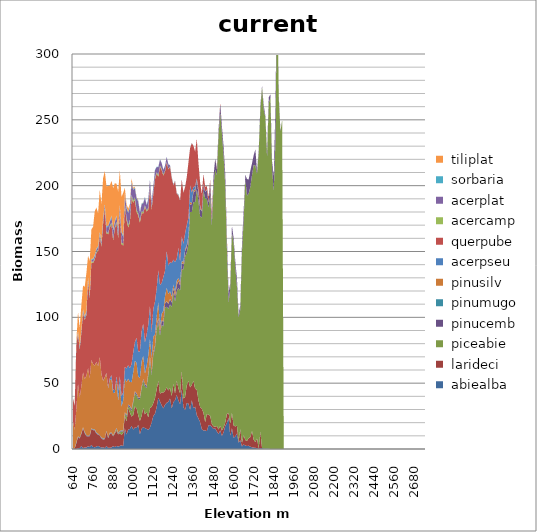
| Category |  abiealba |  larideci |  piceabie |  pinucemb |  pinumugo |  pinusilv |  acerpseu |  querpube |  acercamp |  acerplat |  sorbaria |  tiliplat |
|---|---|---|---|---|---|---|---|---|---|---|---|---|
| 640.0 | 0.045 | 0.165 | 0 | 0.03 | 0.189 | 20.606 | 0 | 17.3 | 0.026 | 0.019 | 0.17 | 0.068 |
| 650.0 | 0.022 | 0.482 | 0 | 0.022 | 0.097 | 14.053 | 0 | 18.349 | 0.005 | 0.007 | 0.205 | 0.013 |
| 660.0 | 0.098 | 4.275 | 0 | 0.074 | 0.725 | 25.1 | 0 | 48.806 | 0.112 | 0.18 | 0.91 | 1.466 |
| 670.0 | 0.57 | 8.573 | 0.001 | 0.202 | 0.327 | 39.903 | 0 | 38.181 | 0.405 | 0.538 | 0.806 | 14.543 |
| 680.0 | 0.747 | 7.256 | 0 | 0.174 | 0.423 | 30.236 | 0 | 36.613 | 0.552 | 1.163 | 0.804 | 14.291 |
| 690.0 | 2.263 | 9.18 | 0.002 | 0.296 | 0.41 | 35.706 | 0.006 | 40.418 | 0.547 | 1.006 | 0.756 | 18.481 |
| 700.0 | 0.754 | 15.101 | 0.001 | 0.322 | 0.296 | 41.645 | 0.026 | 45.237 | 0.714 | 1.195 | 0.726 | 18.106 |
| 710.0 | 1.177 | 10.868 | 0.007 | 0.256 | 0.57 | 40.216 | 0.007 | 44.937 | 0.601 | 1.21 | 0.756 | 22.521 |
| 720.0 | 1.114 | 8.67 | 0.009 | 0.309 | 0.371 | 45.016 | 0.027 | 46.165 | 0.703 | 1.692 | 0.746 | 28.699 |
| 730.0 | 2.077 | 7.333 | 0.012 | 0.393 | 0.241 | 51.374 | 0.028 | 66.482 | 0.728 | 1.085 | 0.638 | 16.408 |
| 740.0 | 1.568 | 8.209 | 0.017 | 0.365 | 0.386 | 43.13 | 0.019 | 60.486 | 0.671 | 1.351 | 0.749 | 25.86 |
| 750.0 | 3.039 | 12.039 | 0.015 | 0.403 | 0.262 | 51.807 | 0.028 | 74.056 | 0.784 | 1.312 | 0.732 | 22.449 |
| 760.0 | 1.551 | 12.736 | 0.032 | 0.302 | 0.314 | 49.598 | 0.033 | 76.826 | 0.766 | 1.515 | 0.733 | 24.263 |
| 770.0 | 1.296 | 12.858 | 0.044 | 0.403 | 0.456 | 48.348 | 0.082 | 80.326 | 0.962 | 1.859 | 0.823 | 33.179 |
| 780.0 | 1.835 | 9.694 | 0.022 | 0.603 | 0.406 | 53.457 | 0.046 | 82.959 | 0.764 | 1.611 | 0.834 | 31.174 |
| 790.0 | 2.346 | 8.57 | 0.029 | 0.438 | 0.269 | 51.284 | 0.111 | 87.372 | 0.913 | 2.004 | 0.793 | 24.904 |
| 800.0 | 1.64 | 8.294 | 0.03 | 0.336 | 0.136 | 59.486 | 0.113 | 91.709 | 0.953 | 1.502 | 0.701 | 32.12 |
| 810.0 | 1.062 | 6.968 | 0.068 | 0.368 | 0.356 | 48.033 | 0.141 | 96.636 | 1.068 | 2.155 | 0.757 | 28.467 |
| 820.0 | 1.347 | 5.834 | 0.123 | 0.393 | 0.361 | 43.688 | 0.203 | 119.248 | 1.184 | 2.582 | 0.582 | 30.173 |
| 830.0 | 0.772 | 6.678 | 0.063 | 0.447 | 0.283 | 45.928 | 0.228 | 127.816 | 0.99 | 2.377 | 0.692 | 25.003 |
| 840.0 | 2.128 | 10.9 | 0.061 | 0.391 | 0.345 | 43.73 | 0.374 | 105.888 | 0.922 | 3.436 | 0.857 | 30.543 |
| 850.0 | 0.929 | 7.341 | 0.122 | 0.313 | 0.325 | 37.367 | 0.67 | 116.093 | 0.89 | 4.943 | 0.699 | 30.018 |
| 860.0 | 0.903 | 10.549 | 0.096 | 0.332 | 0.437 | 39.898 | 1.691 | 114.522 | 0.926 | 2.991 | 0.879 | 26.837 |
| 870.0 | 1.194 | 10.427 | 0.213 | 0.553 | 0.251 | 40.494 | 2.921 | 114.452 | 1.404 | 4.255 | 1.18 | 26.314 |
| 880.0 | 2.166 | 7.409 | 0.204 | 0.318 | 0.219 | 32.124 | 2.841 | 113.205 | 1.113 | 6.529 | 0.697 | 31.377 |
| 890.0 | 1.425 | 10.398 | 0.543 | 0.439 | 0.218 | 29.998 | 1.509 | 122.945 | 1.151 | 3.633 | 0.894 | 28.642 |
| 900.0 | 2.304 | 11.706 | 1.045 | 0.552 | 0.371 | 36.487 | 2.917 | 116.057 | 1.22 | 3.853 | 0.902 | 24.103 |
| 910.0 | 1.826 | 9.283 | 0.486 | 0.48 | 0.189 | 24.493 | 7.513 | 116.055 | 1.265 | 4.622 | 0.902 | 28.293 |
| 920.0 | 2.286 | 9.676 | 0.625 | 0.542 | 0.488 | 36.888 | 4.686 | 123.482 | 1.321 | 4.417 | 0.764 | 26.336 |
| 930.0 | 2.843 | 7.768 | 2.692 | 0.58 | 0.352 | 17.868 | 7.976 | 115.393 | 1.354 | 7.47 | 0.869 | 26.207 |
| 940.0 | 2.255 | 10.007 | 1.147 | 0.59 | 0.146 | 22.882 | 6.05 | 111.531 | 1.421 | 5.092 | 0.993 | 32.527 |
| 950.0 | 15.598 | 9.467 | 1.775 | 0.751 | 0.206 | 25.907 | 8.581 | 122.386 | 1.801 | 6.946 | 0.698 | 4.201 |
| 960.0 | 10.999 | 9.895 | 3.638 | 0.921 | 0.285 | 25.302 | 10.086 | 112.749 | 1.773 | 7.096 | 0.849 | 2.35 |
| 970.0 | 14.794 | 16.235 | 1.497 | 0.922 | 0.326 | 19.682 | 10.166 | 104.563 | 1.639 | 9.415 | 0.771 | 2.54 |
| 980.0 | 15.187 | 12.595 | 3.257 | 1.408 | 0.289 | 18.145 | 10.567 | 110.516 | 1.974 | 9.513 | 0.852 | 1.7 |
| 990.0 | 17.626 | 6.924 | 4.262 | 1.113 | 0.372 | 20.442 | 13.787 | 126.476 | 2.164 | 9.131 | 0.663 | 2.687 |
| 1000.0 | 14.758 | 11.01 | 9.418 | 1.17 | 0.368 | 21.619 | 15.111 | 113.519 | 1.609 | 8.163 | 0.674 | 0.93 |
| 1010.0 | 16.34 | 16.013 | 9.961 | 1.249 | 0.231 | 23.073 | 14.25 | 108.256 | 1.733 | 6.832 | 0.72 | 0.607 |
| 1020.0 | 15.966 | 15.061 | 9.639 | 1.287 | 0.378 | 23.09 | 19.148 | 95.611 | 1.562 | 8.528 | 0.754 | 0.538 |
| 1030.0 | 18.377 | 7.151 | 12.429 | 0.858 | 0.264 | 15.939 | 18.979 | 103.506 | 1.486 | 9.011 | 0.594 | 0.437 |
| 1040.0 | 11.214 | 10.153 | 16.424 | 1.088 | 0.167 | 15.042 | 20.107 | 97.819 | 1.413 | 5.77 | 0.716 | 0.209 |
| 1050.0 | 15.423 | 9.761 | 20.845 | 1.099 | 0.189 | 19.058 | 23.182 | 89.633 | 1.266 | 5.298 | 0.566 | 0.131 |
| 1060.0 | 16.624 | 14.67 | 20.577 | 1.063 | 0.29 | 17.797 | 24.213 | 83.664 | 1.216 | 6.641 | 0.415 | 0.095 |
| 1070.0 | 15.839 | 10.435 | 21.353 | 1.48 | 0.304 | 7.932 | 23.554 | 103.041 | 1.092 | 5.928 | 0.452 | 0.075 |
| 1080.0 | 15.252 | 12.935 | 18.279 | 1.288 | 0.195 | 14.976 | 23.881 | 93.625 | 0.88 | 3.885 | 0.391 | 0.033 |
| 1090.0 | 14.552 | 9.35 | 31.796 | 1.605 | 0.419 | 13.377 | 23.297 | 87.468 | 1.234 | 6.412 | 0.377 | 0.045 |
| 1100.0 | 16.262 | 14.868 | 36.341 | 2.46 | 0.297 | 13.358 | 25.081 | 89.616 | 0.986 | 5.006 | 0.358 | 0.028 |
| 1110.0 | 20.195 | 11.8 | 24.449 | 1.726 | 0.24 | 10.784 | 20.04 | 92.885 | 1.16 | 4.136 | 0.332 | 0.034 |
| 1120.0 | 25.054 | 9.723 | 36.49 | 2.156 | 0.176 | 11.926 | 20.917 | 87.077 | 0.94 | 4.344 | 0.334 | 0.01 |
| 1130.0 | 26.802 | 11.704 | 38.084 | 1.629 | 0.236 | 8.513 | 24.909 | 92.922 | 1.105 | 5.9 | 0.377 | 0.004 |
| 1140.0 | 31.635 | 13.57 | 45.485 | 2.238 | 0.176 | 7.403 | 21.321 | 87.578 | 0.855 | 3.873 | 0.309 | 0.001 |
| 1150.0 | 38.915 | 12.912 | 44.525 | 2.999 | 0.179 | 12.164 | 24.103 | 71.059 | 1.135 | 6.058 | 0.231 | 0.001 |
| 1160.0 | 36.066 | 5.911 | 44.17 | 2.498 | 0.099 | 3.999 | 31.774 | 89.829 | 0.922 | 4.647 | 0.171 | 0.001 |
| 1170.0 | 33.146 | 9.966 | 51.441 | 3.077 | 0.173 | 4.975 | 23.414 | 85.691 | 0.897 | 4.305 | 0.242 | 0 |
| 1180.0 | 30.826 | 11.978 | 50.262 | 3.432 | 0.203 | 8.236 | 25.602 | 77.091 | 0.85 | 3.508 | 0.247 | 0 |
| 1190.0 | 33.594 | 10.64 | 62.838 | 3.374 | 0.17 | 5.468 | 19.341 | 75.275 | 0.73 | 3.546 | 0.205 | 0 |
| 1200.0 | 35.096 | 11.694 | 61.329 | 3.969 | 0.191 | 10.11 | 28.347 | 66.912 | 0.371 | 3.778 | 0.162 | 0 |
| 1210.0 | 35.743 | 8.705 | 61.913 | 3.678 | 0.276 | 7.463 | 21.506 | 73.118 | 0.374 | 3.431 | 0.18 | 0 |
| 1220.0 | 38.485 | 7.852 | 63.553 | 3.968 | 0.169 | 5.982 | 21.9 | 72.467 | 0.356 | 0.709 | 0.163 | 0 |
| 1230.0 | 30.702 | 9.357 | 67.815 | 3.297 | 0.167 | 4.456 | 25.446 | 64.674 | 0.24 | 0.489 | 0.154 | 0 |
| 1240.0 | 35.566 | 13.826 | 69.155 | 3.278 | 0.184 | 2.777 | 18.971 | 56.542 | 0.222 | 0.5 | 0.111 | 0 |
| 1250.0 | 36.976 | 5.206 | 69.856 | 3.79 | 0.089 | 3.267 | 22.872 | 61.274 | 0.237 | 0.292 | 0.192 | 0 |
| 1260.0 | 41.161 | 10.74 | 67.761 | 4.607 | 0.145 | 3.425 | 16.56 | 49.521 | 0.215 | 0.273 | 0.08 | 0 |
| 1270.0 | 36.864 | 9.284 | 76.17 | 5.406 | 0.121 | 1.999 | 22.98 | 39.889 | 0.234 | 0.332 | 0.146 | 0 |
| 1280.0 | 34.014 | 8.223 | 77.911 | 3.975 | 0.217 | 2.538 | 15.679 | 46.072 | 0.197 | 0.258 | 0.127 | 0 |
| 1290.0 | 45.337 | 14.294 | 76.727 | 4.693 | 0.13 | 1.344 | 19.083 | 43.047 | 0.125 | 0.174 | 0.071 | 0 |
| 1300.0 | 31.785 | 6.521 | 98.287 | 3.562 | 0.183 | 2.112 | 13.443 | 38.736 | 0.09 | 0.188 | 0.102 | 0 |
| 1310.0 | 29.403 | 10.059 | 106.527 | 4.299 | 0.094 | 1.19 | 12.054 | 35.306 | 0.055 | 0.117 | 0.076 | 0 |
| 1320.0 | 34.987 | 13.327 | 100.995 | 3.99 | 0.159 | 1.332 | 15.362 | 36.166 | 0.055 | 0.093 | 0.084 | 0 |
| 1330.0 | 34.515 | 17.239 | 103.982 | 4.706 | 0.127 | 1.221 | 13.86 | 42.021 | 0.036 | 0.049 | 0.086 | 0 |
| 1340.0 | 29.758 | 17.036 | 133.289 | 5.28 | 0.242 | 1.938 | 12.64 | 28.36 | 0.022 | 0.036 | 0.075 | 0 |
| 1350.0 | 37.223 | 11.443 | 131.379 | 5.943 | 0.059 | 0.775 | 8.025 | 37.503 | 0.017 | 0.035 | 0.071 | 0 |
| 1360.0 | 30.95 | 20.792 | 135.684 | 7.622 | 0.047 | 1.46 | 2.39 | 31.277 | 0.014 | 0.028 | 0.039 | 0 |
| 1370.0 | 32.12 | 13.649 | 141.867 | 8.136 | 0.059 | 1.37 | 2.489 | 26.163 | 0.01 | 0.012 | 0.052 | 0 |
| 1380.0 | 25.647 | 19.439 | 152.301 | 6.433 | 0.145 | 0.463 | 1.276 | 29.966 | 0.006 | 0.01 | 0.04 | 0 |
| 1390.0 | 23.172 | 13.628 | 151.154 | 5.933 | 0.107 | 1.795 | 1.158 | 20.08 | 0.011 | 0.013 | 0.033 | 0 |
| 1400.0 | 20.374 | 11.461 | 144.844 | 5.674 | 0.132 | 1.682 | 0.773 | 17.485 | 0.005 | 0.007 | 0.046 | 0 |
| 1410.0 | 15.06 | 15.558 | 145.1 | 4.592 | 0.024 | 0.112 | 0.494 | 12.957 | 0 | 0.004 | 0.024 | 0 |
| 1420.0 | 13.959 | 13.577 | 168.637 | 4.473 | 0.002 | 0.512 | 0.578 | 7.208 | 0 | 0.001 | 0.011 | 0 |
| 1430.0 | 14.23 | 6.203 | 169.893 | 4.68 | 0.002 | 0.016 | 0.44 | 3.658 | 0 | 0.001 | 0.008 | 0 |
| 1440.0 | 13.55 | 13.077 | 163.463 | 6.456 | 0.107 | 0.162 | 0.405 | 2.5 | 0 | 0.001 | 0.012 | 0 |
| 1450.0 | 17.95 | 8.092 | 157.37 | 3.671 | 0.015 | 0.055 | 0.322 | 3.754 | 0 | 0 | 0.013 | 0 |
| 1460.0 | 18.104 | 7.12 | 166.808 | 9.259 | 0.082 | 0.473 | 0.246 | 2.441 | 0 | 0 | 0.005 | 0 |
| 1470.0 | 16.638 | 2.348 | 150.881 | 4.305 | 0.166 | 0.316 | 0.152 | 4.447 | 0 | 0 | 0.004 | 0 |
| 1480.0 | 15.212 | 2.043 | 183.329 | 6.586 | 0.026 | 0.005 | 0.109 | 0.189 | 0 | 0 | 0.007 | 0 |
| 1490.0 | 15.632 | 1.194 | 195.193 | 8.454 | 0.008 | 0.006 | 0.101 | 0.051 | 0 | 0 | 0.001 | 0 |
| 1500.0 | 13.317 | 4.111 | 190.842 | 4.34 | 0.076 | 0.488 | 0.109 | 0.647 | 0 | 0 | 0.003 | 0 |
| 1510.0 | 11.319 | 3.467 | 223.963 | 3.545 | 0.025 | 0.215 | 0.028 | 0.192 | 0 | 0 | 0 | 0 |
| 1520.0 | 14.156 | 3.498 | 237.936 | 6.402 | 0.01 | 0.223 | 0.052 | 0.765 | 0 | 0 | 0 | 0 |
| 1530.0 | 9.875 | 4.17 | 225.889 | 5.264 | 0.04 | 0.062 | 0.042 | 0.026 | 0 | 0 | 0 | 0 |
| 1540.0 | 12.646 | 3.795 | 206.668 | 6.664 | 0.157 | 0.061 | 0.013 | 0.033 | 0 | 0 | 0 | 0 |
| 1550.0 | 17.311 | 2.61 | 179.89 | 8.876 | 0.223 | 0.499 | 0.015 | 0.017 | 0 | 0 | 0 | 0 |
| 1560.0 | 19.854 | 6.925 | 124.693 | 7.415 | 0.208 | 2.085 | 0.005 | 0.077 | 0 | 0 | 0 | 0 |
| 1570.0 | 23.539 | 3.744 | 84.114 | 6.823 | 0.455 | 0.298 | 0.002 | 0.036 | 0 | 0 | 0 | 0 |
| 1580.0 | 9.95 | 9.152 | 102.982 | 3.732 | 0 | 0.329 | 0 | 0 | 0 | 0 | 0 | 0 |
| 1590.0 | 15.758 | 11.684 | 136.405 | 5.656 | 0 | 0 | 0 | 0.013 | 0 | 0 | 0 | 0 |
| 1600.0 | 8.491 | 9.452 | 138.997 | 3.273 | 0 | 0 | 0 | 0.004 | 0 | 0 | 0 | 0 |
| 1610.0 | 9.629 | 7.5 | 121.045 | 4.661 | 0.117 | 0.035 | 0 | 0.003 | 0 | 0 | 0 | 0 |
| 1620.0 | 11.676 | 6.011 | 105.545 | 6.178 | 0.052 | 0.193 | 0 | 0 | 0 | 0 | 0 | 0 |
| 1630.0 | 4.848 | 0.955 | 94.472 | 2.149 | 0.097 | 0.002 | 0 | 0.002 | 0 | 0 | 0 | 0 |
| 1640.0 | 6.632 | 8.587 | 90.572 | 3.474 | 0.052 | 0.035 | 0 | 0 | 0 | 0 | 0 | 0 |
| 1650.0 | 1.863 | 2.772 | 145.169 | 5.782 | 0.01 | 0.003 | 0 | 0 | 0 | 0 | 0 | 0 |
| 1660.0 | 3.516 | 6.996 | 162.733 | 7.312 | 0.133 | 0.022 | 0 | 0.004 | 0 | 0 | 0 | 0 |
| 1670.0 | 2.635 | 4.109 | 198.21 | 3.276 | 0 | 0 | 0 | 0 | 0 | 0 | 0 | 0 |
| 1680.0 | 2.285 | 3.894 | 186.289 | 12.525 | 0 | 0 | 0 | 0 | 0 | 0 | 0 | 0 |
| 1690.0 | 2.473 | 5.789 | 185.633 | 10.802 | 0 | 0.022 | 0 | 0 | 0 | 0 | 0 | 0 |
| 1700.0 | 1.758 | 7.204 | 190.215 | 12.143 | 0 | 0 | 0 | 0 | 0 | 0 | 0 | 0 |
| 1710.0 | 1.226 | 12.443 | 194.346 | 8.955 | 0 | 0 | 0 | 0 | 0 | 0 | 0 | 0 |
| 1720.0 | 1.063 | 5.918 | 208.722 | 7.429 | 0 | 0 | 0 | 0 | 0 | 0 | 0 | 0 |
| 1730.0 | 0.946 | 4.363 | 210.02 | 12.136 | 0 | 0 | 0 | 0 | 0 | 0 | 0 | 0 |
| 1740.0 | 0.558 | 7.463 | 200.795 | 2.017 | 0 | 0 | 0 | 0 | 0 | 0 | 0 | 0 |
| 1750.0 | 0.428 | 0 | 224.93 | 1.892 | 0 | 0 | 0 | 0 | 0 | 0 | 0 | 0 |
| 1760.0 | 0.446 | 12.407 | 244.848 | 3.287 | 0.07 | 0 | 0 | 0 | 0 | 0 | 0 | 0 |
| 1770.0 | 0.568 | 0 | 274.458 | 0.966 | 0 | 0 | 0 | 0 | 0 | 0 | 0 | 0 |
| 1780.0 | 0.44 | 0 | 257.227 | 3.488 | 0 | 0 | 0 | 0 | 0 | 0 | 0 | 0 |
| 1790.0 | 0.19 | 0 | 251.614 | 1.099 | 0 | 0 | 0 | 0 | 0 | 0 | 0 | 0 |
| 1800.0 | 0.348 | 0 | 220.92 | 4.276 | 0 | 0 | 0 | 0 | 0 | 0 | 0 | 0 |
| 1810.0 | 0.184 | 0 | 262.449 | 4.45 | 0 | 0 | 0 | 0 | 0 | 0 | 0 | 0 |
| 1820.0 | 0.025 | 0 | 266.749 | 2.547 | 0 | 0 | 0 | 0 | 0 | 0 | 0 | 0 |
| 1830.0 | 0 | 0 | 213.536 | 4.899 | 0 | 0 | 0 | 0 | 0 | 0 | 0 | 0 |
| 1840.0 | 0 | 0 | 195.533 | 11.402 | 0 | 0 | 0 | 0 | 0 | 0 | 0 | 0 |
| 1850.0 | 0 | 0 | 232.883 | 27.498 | 0 | 0 | 0 | 0 | 0 | 0 | 0 | 0 |
| 1860.0 | 0 | 0 | 358.886 | 0 | 0 | 0 | 0 | 0 | 0 | 0 | 0 | 0 |
| 1870.0 | 0 | 0 | 265.591 | 3.336 | 0 | 0 | 0 | 0 | 0 | 0 | 0 | 0 |
| 1880.0 | 0 | 0 | 241.064 | 0.724 | 0 | 0 | 0 | 0 | 0 | 0 | 0 | 0 |
| 1890.0 | 0 | 0 | 249.871 | 0 | 0 | 0 | 0 | 0 | 0 | 0 | 0 | 0 |
| 1900.0 | 0 | 0 | 0 | 0 | 0 | 0 | 0 | 0 | 0 | 0 | 0 | 0 |
| 1910.0 | 0 | 0 | 0 | 0 | 0 | 0 | 0 | 0 | 0 | 0 | 0 | 0 |
| 1920.0 | 0 | 0 | 0 | 0 | 0 | 0 | 0 | 0 | 0 | 0 | 0 | 0 |
| 1930.0 | 0 | 0 | 0 | 0 | 0 | 0 | 0 | 0 | 0 | 0 | 0 | 0 |
| 1940.0 | 0 | 0 | 0 | 0 | 0 | 0 | 0 | 0 | 0 | 0 | 0 | 0 |
| 1950.0 | 0 | 0 | 0 | 0 | 0 | 0 | 0 | 0 | 0 | 0 | 0 | 0 |
| 1960.0 | 0 | 0 | 0 | 0 | 0 | 0 | 0 | 0 | 0 | 0 | 0 | 0 |
| 1970.0 | 0 | 0 | 0 | 0 | 0 | 0 | 0 | 0 | 0 | 0 | 0 | 0 |
| 1980.0 | 0 | 0 | 0 | 0 | 0 | 0 | 0 | 0 | 0 | 0 | 0 | 0 |
| 1990.0 | 0 | 0 | 0 | 0 | 0 | 0 | 0 | 0 | 0 | 0 | 0 | 0 |
| 2000.0 | 0 | 0 | 0 | 0 | 0 | 0 | 0 | 0 | 0 | 0 | 0 | 0 |
| 2010.0 | 0 | 0 | 0 | 0 | 0 | 0 | 0 | 0 | 0 | 0 | 0 | 0 |
| 2020.0 | 0 | 0 | 0 | 0 | 0 | 0 | 0 | 0 | 0 | 0 | 0 | 0 |
| 2030.0 | 0 | 0 | 0 | 0 | 0 | 0 | 0 | 0 | 0 | 0 | 0 | 0 |
| 2040.0 | 0 | 0 | 0 | 0 | 0 | 0 | 0 | 0 | 0 | 0 | 0 | 0 |
| 2050.0 | 0 | 0 | 0 | 0 | 0 | 0 | 0 | 0 | 0 | 0 | 0 | 0 |
| 2060.0 | 0 | 0 | 0 | 0 | 0 | 0 | 0 | 0 | 0 | 0 | 0 | 0 |
| 2070.0 | 0 | 0 | 0 | 0 | 0 | 0 | 0 | 0 | 0 | 0 | 0 | 0 |
| 2080.0 | 0 | 0 | 0 | 0 | 0 | 0 | 0 | 0 | 0 | 0 | 0 | 0 |
| 2090.0 | 0 | 0 | 0 | 0 | 0 | 0 | 0 | 0 | 0 | 0 | 0 | 0 |
| 2100.0 | 0 | 0 | 0 | 0 | 0 | 0 | 0 | 0 | 0 | 0 | 0 | 0 |
| 2110.0 | 0 | 0 | 0 | 0 | 0 | 0 | 0 | 0 | 0 | 0 | 0 | 0 |
| 2120.0 | 0 | 0 | 0 | 0 | 0 | 0 | 0 | 0 | 0 | 0 | 0 | 0 |
| 2130.0 | 0 | 0 | 0 | 0 | 0 | 0 | 0 | 0 | 0 | 0 | 0 | 0 |
| 2140.0 | 0 | 0 | 0 | 0 | 0 | 0 | 0 | 0 | 0 | 0 | 0 | 0 |
| 2150.0 | 0 | 0 | 0 | 0 | 0 | 0 | 0 | 0 | 0 | 0 | 0 | 0 |
| 2160.0 | 0 | 0 | 0 | 0 | 0 | 0 | 0 | 0 | 0 | 0 | 0 | 0 |
| 2170.0 | 0 | 0 | 0 | 0 | 0 | 0 | 0 | 0 | 0 | 0 | 0 | 0 |
| 2180.0 | 0 | 0 | 0 | 0 | 0 | 0 | 0 | 0 | 0 | 0 | 0 | 0 |
| 2190.0 | 0 | 0 | 0 | 0 | 0 | 0 | 0 | 0 | 0 | 0 | 0 | 0 |
| 2200.0 | 0 | 0 | 0 | 0 | 0 | 0 | 0 | 0 | 0 | 0 | 0 | 0 |
| 2210.0 | 0 | 0 | 0 | 0 | 0 | 0 | 0 | 0 | 0 | 0 | 0 | 0 |
| 2220.0 | 0 | 0 | 0 | 0 | 0 | 0 | 0 | 0 | 0 | 0 | 0 | 0 |
| 2230.0 | 0 | 0 | 0 | 0 | 0 | 0 | 0 | 0 | 0 | 0 | 0 | 0 |
| 2240.0 | 0 | 0 | 0 | 0 | 0 | 0 | 0 | 0 | 0 | 0 | 0 | 0 |
| 2250.0 | 0 | 0 | 0 | 0 | 0 | 0 | 0 | 0 | 0 | 0 | 0 | 0 |
| 2260.0 | 0 | 0 | 0 | 0 | 0 | 0 | 0 | 0 | 0 | 0 | 0 | 0 |
| 2270.0 | 0 | 0 | 0 | 0 | 0 | 0 | 0 | 0 | 0 | 0 | 0 | 0 |
| 2280.0 | 0 | 0 | 0 | 0 | 0 | 0 | 0 | 0 | 0 | 0 | 0 | 0 |
| 2290.0 | 0 | 0 | 0 | 0 | 0 | 0 | 0 | 0 | 0 | 0 | 0 | 0 |
| 2300.0 | 0 | 0 | 0 | 0 | 0 | 0 | 0 | 0 | 0 | 0 | 0 | 0 |
| 2310.0 | 0 | 0 | 0 | 0 | 0 | 0 | 0 | 0 | 0 | 0 | 0 | 0 |
| 2320.0 | 0 | 0 | 0 | 0 | 0 | 0 | 0 | 0 | 0 | 0 | 0 | 0 |
| 2330.0 | 0 | 0 | 0 | 0 | 0 | 0 | 0 | 0 | 0 | 0 | 0 | 0 |
| 2340.0 | 0 | 0 | 0 | 0 | 0 | 0 | 0 | 0 | 0 | 0 | 0 | 0 |
| 2350.0 | 0 | 0 | 0 | 0 | 0 | 0 | 0 | 0 | 0 | 0 | 0 | 0 |
| 2360.0 | 0 | 0 | 0 | 0 | 0 | 0 | 0 | 0 | 0 | 0 | 0 | 0 |
| 2370.0 | 0 | 0 | 0 | 0 | 0 | 0 | 0 | 0 | 0 | 0 | 0 | 0 |
| 2380.0 | 0 | 0 | 0 | 0 | 0 | 0 | 0 | 0 | 0 | 0 | 0 | 0 |
| 2390.0 | 0 | 0 | 0 | 0 | 0 | 0 | 0 | 0 | 0 | 0 | 0 | 0 |
| 2400.0 | 0 | 0 | 0 | 0 | 0 | 0 | 0 | 0 | 0 | 0 | 0 | 0 |
| 2410.0 | 0 | 0 | 0 | 0 | 0 | 0 | 0 | 0 | 0 | 0 | 0 | 0 |
| 2420.0 | 0 | 0 | 0 | 0 | 0 | 0 | 0 | 0 | 0 | 0 | 0 | 0 |
| 2430.0 | 0 | 0 | 0 | 0 | 0 | 0 | 0 | 0 | 0 | 0 | 0 | 0 |
| 2440.0 | 0 | 0 | 0 | 0 | 0 | 0 | 0 | 0 | 0 | 0 | 0 | 0 |
| 2450.0 | 0 | 0 | 0 | 0 | 0 | 0 | 0 | 0 | 0 | 0 | 0 | 0 |
| 2460.0 | 0 | 0 | 0 | 0 | 0 | 0 | 0 | 0 | 0 | 0 | 0 | 0 |
| 2470.0 | 0 | 0 | 0 | 0 | 0 | 0 | 0 | 0 | 0 | 0 | 0 | 0 |
| 2480.0 | 0 | 0 | 0 | 0 | 0 | 0 | 0 | 0 | 0 | 0 | 0 | 0 |
| 2490.0 | 0 | 0 | 0 | 0 | 0 | 0 | 0 | 0 | 0 | 0 | 0 | 0 |
| 2500.0 | 0 | 0 | 0 | 0 | 0 | 0 | 0 | 0 | 0 | 0 | 0 | 0 |
| 2510.0 | 0 | 0 | 0 | 0 | 0 | 0 | 0 | 0 | 0 | 0 | 0 | 0 |
| 2520.0 | 0 | 0 | 0 | 0 | 0 | 0 | 0 | 0 | 0 | 0 | 0 | 0 |
| 2530.0 | 0 | 0 | 0 | 0 | 0 | 0 | 0 | 0 | 0 | 0 | 0 | 0 |
| 2540.0 | 0 | 0 | 0 | 0 | 0 | 0 | 0 | 0 | 0 | 0 | 0 | 0 |
| 2550.0 | 0 | 0 | 0 | 0 | 0 | 0 | 0 | 0 | 0 | 0 | 0 | 0 |
| 2560.0 | 0 | 0 | 0 | 0 | 0 | 0 | 0 | 0 | 0 | 0 | 0 | 0 |
| 2570.0 | 0 | 0 | 0 | 0 | 0 | 0 | 0 | 0 | 0 | 0 | 0 | 0 |
| 2580.0 | 0 | 0 | 0 | 0 | 0 | 0 | 0 | 0 | 0 | 0 | 0 | 0 |
| 2590.0 | 0 | 0 | 0 | 0 | 0 | 0 | 0 | 0 | 0 | 0 | 0 | 0 |
| 2600.0 | 0 | 0 | 0 | 0 | 0 | 0 | 0 | 0 | 0 | 0 | 0 | 0 |
| 2610.0 | 0 | 0 | 0 | 0 | 0 | 0 | 0 | 0 | 0 | 0 | 0 | 0 |
| 2620.0 | 0 | 0 | 0 | 0 | 0 | 0 | 0 | 0 | 0 | 0 | 0 | 0 |
| 2630.0 | 0 | 0 | 0 | 0 | 0 | 0 | 0 | 0 | 0 | 0 | 0 | 0 |
| 2640.0 | 0 | 0 | 0 | 0 | 0 | 0 | 0 | 0 | 0 | 0 | 0 | 0 |
| 2650.0 | 0 | 0 | 0 | 0 | 0 | 0 | 0 | 0 | 0 | 0 | 0 | 0 |
| 2660.0 | 0 | 0 | 0 | 0 | 0 | 0 | 0 | 0 | 0 | 0 | 0 | 0 |
| 2670.0 | 0 | 0 | 0 | 0 | 0 | 0 | 0 | 0 | 0 | 0 | 0 | 0 |
| 2680.0 | 0 | 0 | 0 | 0 | 0 | 0 | 0 | 0 | 0 | 0 | 0 | 0 |
| 2690.0 | 0 | 0 | 0 | 0 | 0 | 0 | 0 | 0 | 0 | 0 | 0 | 0 |
| 2700.0 | 0 | 0 | 0 | 0 | 0 | 0 | 0 | 0 | 0 | 0 | 0 | 0 |
| 2710.0 | 0 | 0 | 0 | 0 | 0 | 0 | 0 | 0 | 0 | 0 | 0 | 0 |
| 2720.0 | 0 | 0 | 0 | 0 | 0 | 0 | 0 | 0 | 0 | 0 | 0 | 0 |
| 2730.0 | 0 | 0 | 0 | 0 | 0 | 0 | 0 | 0 | 0 | 0 | 0 | 0 |
| 2740.0 | 0 | 0 | 0 | 0 | 0 | 0 | 0 | 0 | 0 | 0 | 0 | 0 |
| 2750.0 | 0 | 0 | 0 | 0 | 0 | 0 | 0 | 0 | 0 | 0 | 0 | 0 |